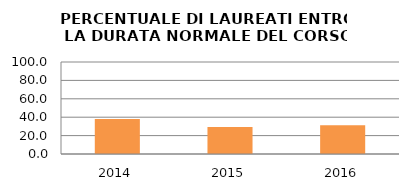
| Category | 2014 2015 2016 |
|---|---|
| 2014.0 | 37.931 |
| 2015.0 | 29.412 |
| 2016.0 | 31.25 |